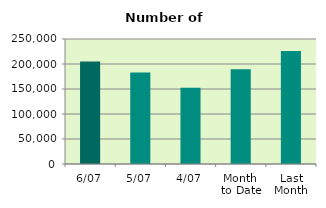
| Category | Series 0 |
|---|---|
| 6/07 | 205148 |
| 5/07 | 182926 |
| 4/07 | 152332 |
| Month 
to Date | 189425 |
| Last
Month | 226069.545 |